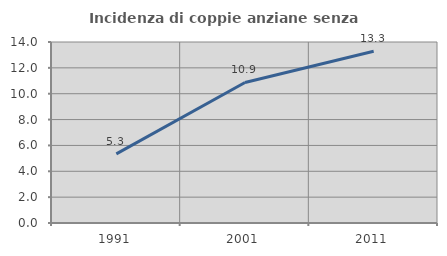
| Category | Incidenza di coppie anziane senza figli  |
|---|---|
| 1991.0 | 5.344 |
| 2001.0 | 10.87 |
| 2011.0 | 13.281 |